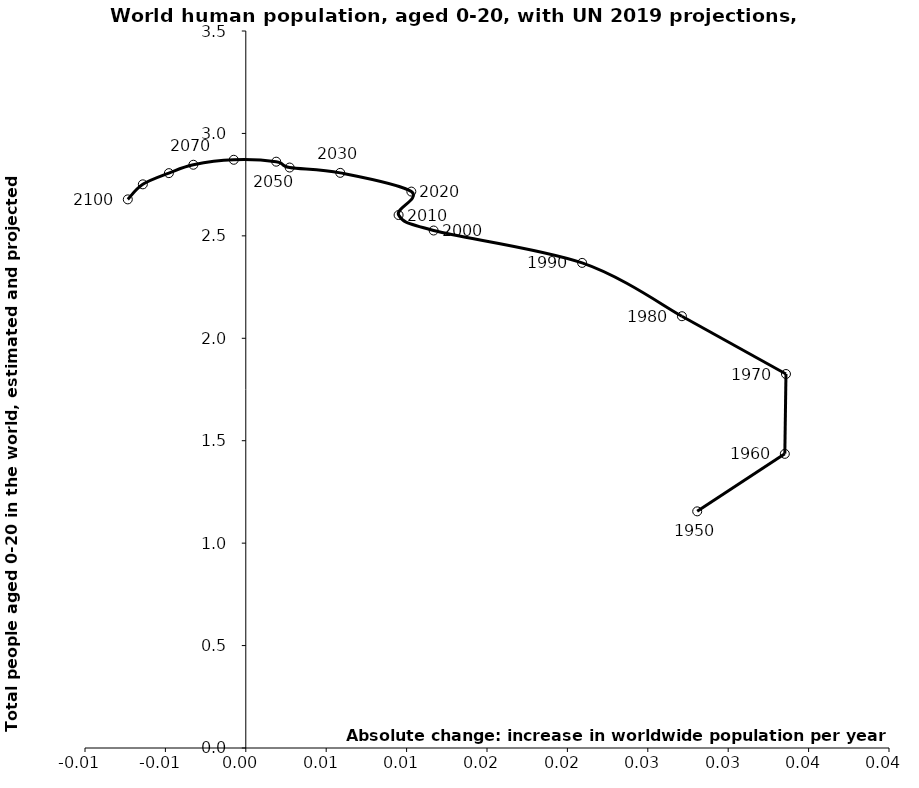
| Category | Series 0 |
|---|---|
| 0.028072569899999955 | 1.155 |
| 0.03352156539999999 | 1.436 |
| 0.03359233375 | 1.826 |
| 0.02712174475000002 | 2.108 |
| 0.02091657455 | 2.368 |
| 0.011682033750000032 | 2.526 |
| 0.009501973200000013 | 2.602 |
| 0.01029455929999996 | 2.716 |
| 0.005873644899999997 | 2.808 |
| 0.002726157149999975 | 2.834 |
| 0.0018905408000000179 | 2.862 |
| -0.0007473909500000042 | 2.871 |
| -0.003261401949999976 | 2.847 |
| -0.004783192050000018 | 2.806 |
| -0.00640364675000007 | 2.751 |
| -0.007338347799999978 | 2.678 |